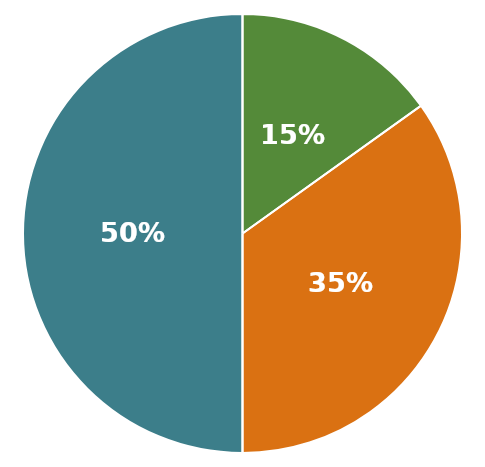
| Category | Skupaj Sredstva |
|---|---|
| 0 | 1902500 |
| 1 | 575000 |
| 2 | 1327500 |